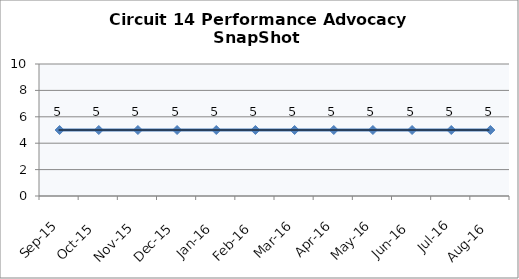
| Category | Circuit 14 |
|---|---|
| Sep-15 | 5 |
| Oct-15 | 5 |
| Nov-15 | 5 |
| Dec-15 | 5 |
| Jan-16 | 5 |
| Feb-16 | 5 |
| Mar-16 | 5 |
| Apr-16 | 5 |
| May-16 | 5 |
| Jun-16 | 5 |
| Jul-16 | 5 |
| Aug-16 | 5 |